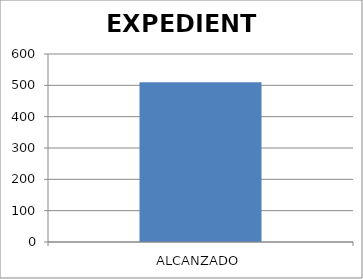
| Category | EXPEDIENTE |
|---|---|
| ALCANZADO | 510 |